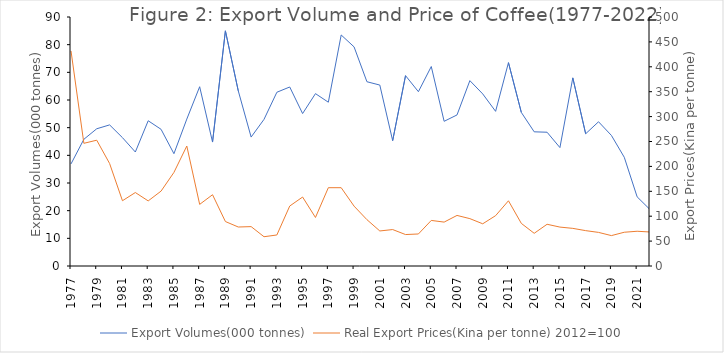
| Category | Export Volumes(000 tonnes) |
|---|---|
| 1977.0 | 36.9 |
| 1978.0 | 45.8 |
| 1979.0 | 49.6 |
| 1980.0 | 51 |
| 1981.0 | 46.4 |
| 1982.0 | 41.2 |
| 1983.0 | 52.5 |
| 1984.0 | 49.4 |
| 1985.0 | 40.6 |
| 1986.0 | 53.1 |
| 1987.0 | 64.8 |
| 1988.0 | 44.8 |
| 1989.0 | 85 |
| 1990.0 | 63.3 |
| 1991.0 | 46.6 |
| 1992.0 | 53 |
| 1993.0 | 62.8 |
| 1994.0 | 64.7 |
| 1995.0 | 55.1 |
| 1996.0 | 62.3 |
| 1997.0 | 59.2 |
| 1998.0 | 83.5 |
| 1999.0 | 79.2 |
| 2000.0 | 66.6 |
| 2001.0 | 65.4 |
| 2002.0 | 45.3 |
| 2003.0 | 68.8 |
| 2004.0 | 63 |
| 2005.0 | 72.1 |
| 2006.0 | 52.3 |
| 2007.0 | 54.6 |
| 2008.0 | 67 |
| 2009.0 | 62.2 |
| 2010.0 | 55.9 |
| 2011.0 | 73.5 |
| 2012.0 | 55.5 |
| 2013.0 | 48.5 |
| 2014.0 | 48.352 |
| 2015.0 | 42.8 |
| 2016.0 | 68 |
| 2017.0 | 47.8 |
| 2018.0 | 52.128 |
| 2019.0 | 47.2 |
| 2020.0 | 39.3 |
| 2021.0 | 25 |
| 2022.0 | 20.4 |